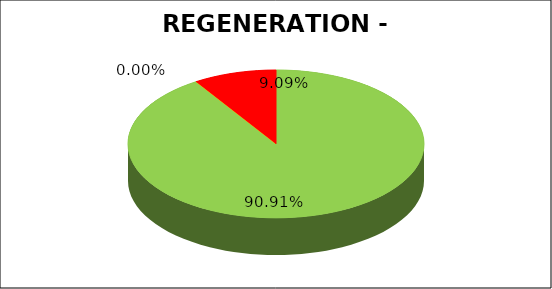
| Category | Series 0 |
|---|---|
| Green | 0.909 |
| Amber | 0 |
| Red | 0.091 |